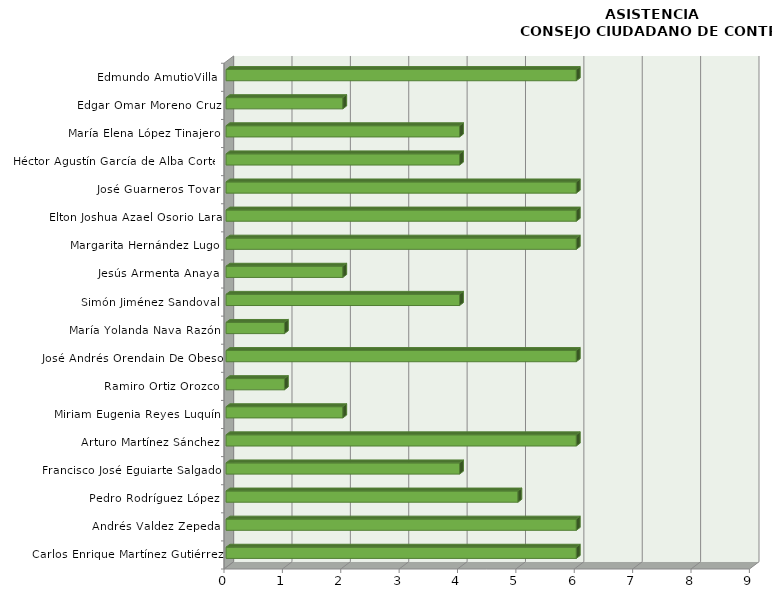
| Category | Series 0 |
|---|---|
| Carlos Enrique Martínez Gutiérrez | 6 |
| Andrés Valdez Zepeda | 6 |
| Pedro Rodríguez López | 5 |
| Francisco José Eguiarte Salgado | 4 |
| Arturo Martínez Sánchez | 6 |
| Miriam Eugenia Reyes Luquín | 2 |
| Ramiro Ortiz Orozco | 1 |
| José Andrés Orendain De Obeso | 6 |
| María Yolanda Nava Razón | 1 |
| Simón Jiménez Sandoval | 4 |
| Jesús Armenta Anaya | 2 |
| Margarita Hernández Lugo | 6 |
| Elton Joshua Azael Osorio Lara | 6 |
| José Guarneros Tovar | 6 |
| Héctor Agustín García de Alba Cortez | 4 |
| María Elena López Tinajero | 4 |
| Edgar Omar Moreno Cruz | 2 |
| Edmundo AmutioVilla | 6 |